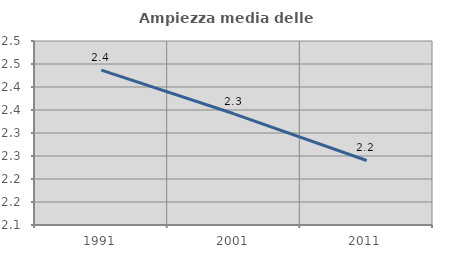
| Category | Ampiezza media delle famiglie |
|---|---|
| 1991.0 | 2.437 |
| 2001.0 | 2.342 |
| 2011.0 | 2.24 |